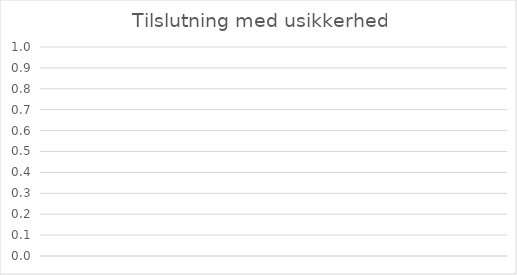
| Category | Series 0 | Series 1 | Series 2 |
|---|---|---|---|
|  | 0 | 0 | 0 |
|  | 0 | 0 | 0 |
|  | 0 | 0 | 0 |
|  | 0 | 0 | 0 |
|  | 0 | 0 | 0 |
|  | 0 | 0 | 0 |
|  | 0 | 0 | 0 |
|  | 0 | 0 | 0 |
|  | 0 | 0 | 0 |
|  | 0 | 0 | 0 |
|  | 0 | 0 | 0 |